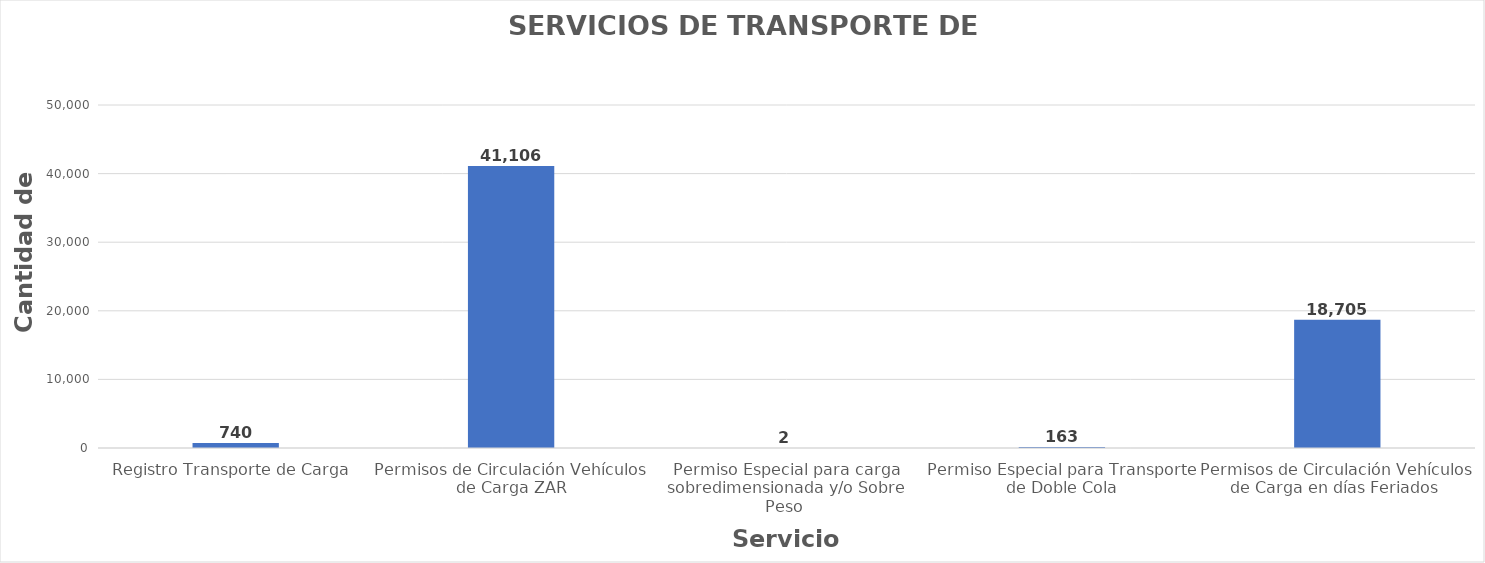
| Category | Series 0 |
|---|---|
| Registro Transporte de Carga  | 740 |
| Permisos de Circulación Vehículos de Carga ZAR | 41106 |
| Permiso Especial para carga sobredimensionada y/o Sobre Peso  | 2 |
| Permiso Especial para Transporte de Doble Cola | 163 |
| Permisos de Circulación Vehículos de Carga en días Feriados  | 18705 |